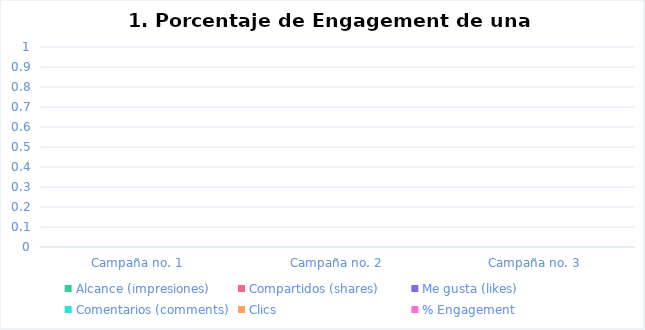
| Category | Alcance (impresiones) | Compartidos (shares) | Me gusta (likes) | Comentarios (comments) | Clics | % Engagement |
|---|---|---|---|---|---|---|
| Campaña no. 1 |  |  |  |  |  | 0 |
| Campaña no. 2 |  |  |  |  |  | 0 |
| Campaña no. 3 |  |  |  |  |  | 0 |